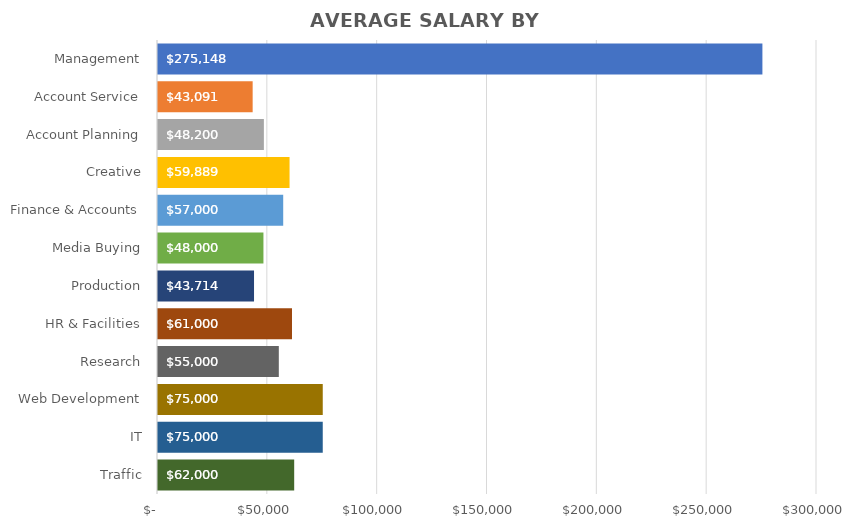
| Category | AVG SALARY |
|---|---|
| Management | 275148 |
| Account Service | 43091 |
| Account Planning | 48200 |
| Creative | 59889 |
| Finance & Accounts | 57000 |
| Media Buying | 48000 |
| Production | 43714 |
| HR & Facilities | 61000 |
| Research | 55000 |
| Web Development | 75000 |
| IT | 75000 |
| Traffic | 62000 |